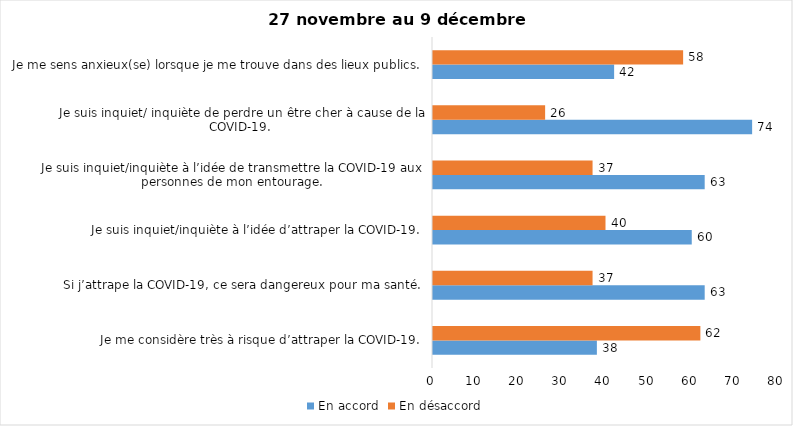
| Category | En accord | En désaccord |
|---|---|---|
| Je me considère très à risque d’attraper la COVID-19. | 38 | 62 |
| Si j’attrape la COVID-19, ce sera dangereux pour ma santé. | 63 | 37 |
| Je suis inquiet/inquiète à l’idée d’attraper la COVID-19. | 60 | 40 |
| Je suis inquiet/inquiète à l’idée de transmettre la COVID-19 aux personnes de mon entourage. | 63 | 37 |
| Je suis inquiet/ inquiète de perdre un être cher à cause de la COVID-19. | 74 | 26 |
| Je me sens anxieux(se) lorsque je me trouve dans des lieux publics. | 42 | 58 |